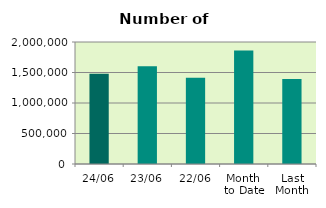
| Category | Series 0 |
|---|---|
| 24/06 | 1479632 |
| 23/06 | 1603172 |
| 22/06 | 1413876 |
| Month 
to Date | 1860623.111 |
| Last
Month | 1395416 |